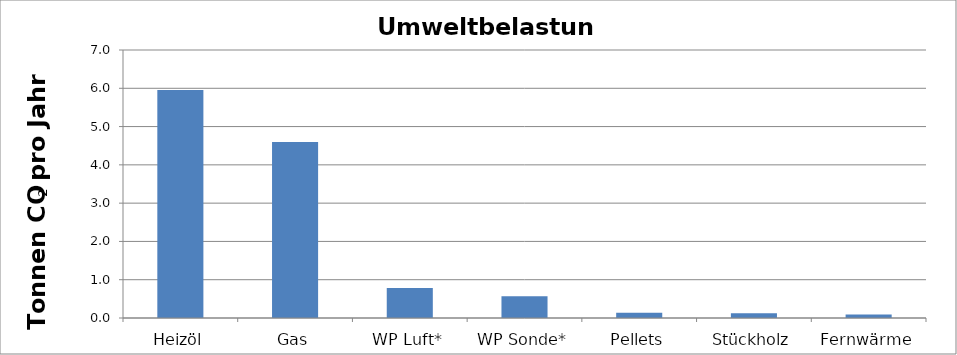
| Category | Umweltbelastung |
|---|---|
| Heizöl | 5.954 |
| Gas | 4.6 |
| WP Luft* | 0.785 |
| WP Sonde* | 0.567 |
| Pellets | 0.138 |
| Stückholz | 0.123 |
| Fernwärme | 0.092 |